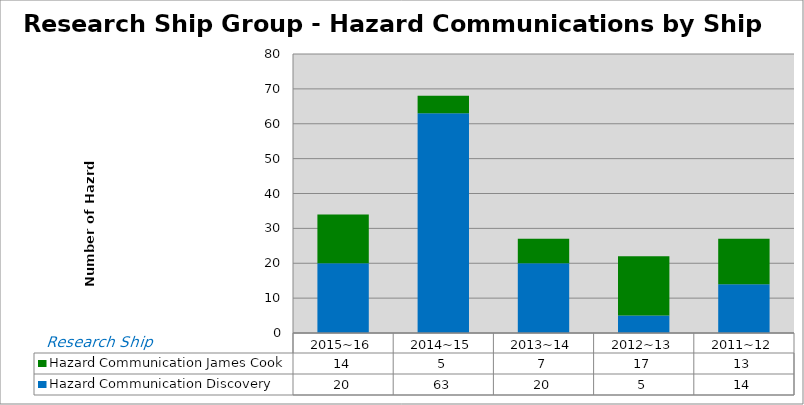
| Category | Hazard Communication |
|---|---|
| 2015~16 | 14 |
| 2014~15 | 5 |
| 2013~14 | 7 |
| 2012~13 | 17 |
| 2011~12 | 13 |